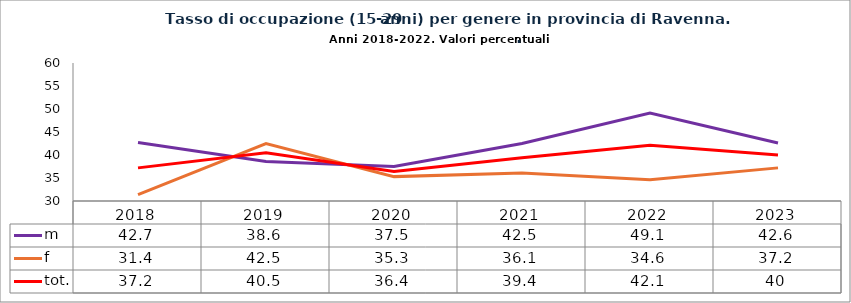
| Category | m | f | tot. |
|---|---|---|---|
| 2018.0 | 42.7 | 31.4 | 37.2 |
| 2019.0 | 38.6 | 42.5 | 40.5 |
| 2020.0 | 37.5 | 35.3 | 36.4 |
| 2021.0 | 42.5 | 36.1 | 39.4 |
| 2022.0 | 49.1 | 34.6 | 42.1 |
| 2023.0 | 42.6 | 37.2 | 40 |